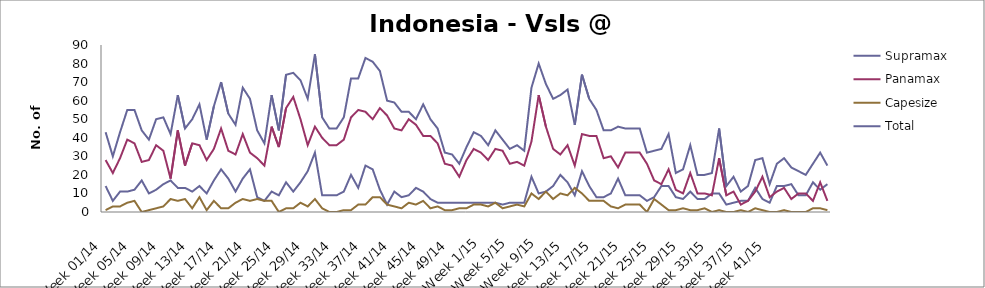
| Category | Supramax | Panamax | Capesize | Total |
|---|---|---|---|---|
| Week 01/14 | 14 | 28 | 1 | 43 |
| Week 02/14 | 6 | 21 | 3 | 30 |
| Week 03/14 | 11 | 29 | 3 | 43 |
| Week 04/14 | 11 | 39 | 5 | 55 |
| Week 05/14 | 12 | 37 | 6 | 55 |
| Week 06/14 | 17 | 27 | 0 | 44 |
| Week 07/14 | 10 | 28 | 1 | 39 |
| Week 08/14 | 12 | 36 | 2 | 50 |
| Week 09/14 | 15 | 33 | 3 | 51 |
| Week 10/14 | 17 | 18 | 7 | 42 |
| Week 11/14 | 13 | 44 | 6 | 63 |
| Week 12/14 | 13 | 25 | 7 | 45 |
| Week 13/14 | 11 | 37 | 2 | 50 |
| Week 14/14 | 14 | 36 | 8 | 58 |
| Week 15/14 | 10 | 28 | 1 | 39 |
| Week 16/14 | 17 | 34 | 6 | 57 |
| Week 17/14 | 23 | 45 | 2 | 70 |
| Week 18/14 | 18 | 33 | 2 | 53 |
| Week 19/14 | 11 | 31 | 5 | 47 |
| Week 20/14 | 18 | 42 | 7 | 67 |
| Week 21/14 | 23 | 32 | 6 | 61 |
| Week 22/14 | 8 | 29 | 7 | 44 |
| Week 23/14 | 6 | 25 | 6 | 37 |
| Week 24/14 | 11 | 46 | 6 | 63 |
| Week 25/14 | 9 | 35 | 0 | 44 |
| Week 26/14 | 16 | 56 | 2 | 74 |
| Week 27/14 | 11 | 62 | 2 | 75 |
| Week 28/14 | 16 | 50 | 5 | 71 |
| Week 29/14 | 22 | 36 | 3 | 61 |
| Week 30/14 | 32 | 46 | 7 | 85 |
| Week 31/14 | 9 | 40 | 2 | 51 |
| Week 32/14 | 9 | 36 | 0 | 45 |
| Week 33/14 | 9 | 36 | 0 | 45 |
| Week 34/14 | 11 | 39 | 1 | 51 |
| Week 35/14 | 20 | 51 | 1 | 72 |
| Week 36/14 | 13 | 55 | 4 | 72 |
| Week 37/14 | 25 | 54 | 4 | 83 |
| Week 38/14 | 23 | 50 | 8 | 81 |
| Week 39/14 | 12 | 56 | 8 | 76 |
| Week 40/14 | 4 | 52 | 4 | 60 |
| Week 41/14 | 11 | 45 | 3 | 59 |
| Week 42/14 | 8 | 44 | 2 | 54 |
| Week 43/14 | 9 | 50 | 5 | 54 |
| Week 44/14 | 13 | 47 | 4 | 50 |
| Week 45/14 | 11 | 41 | 6 | 58 |
| Week 46/14 | 7 | 41 | 2 | 50 |
| Week 47/14 | 5 | 37 | 3 | 45 |
| Week 48/14 | 5 | 26 | 1 | 32 |
| Week 49/14 | 5 | 25 | 1 | 31 |
| Week 50/14 | 5 | 19 | 2 | 26 |
| Week 51/14 | 5 | 28 | 2 | 35 |
| Week 52/14 | 5 | 34 | 4 | 43 |
| Week 1/15 | 5 | 32 | 4 | 41 |
| Week 2/15 | 5 | 28 | 3 | 36 |
| Week 3/15 | 5 | 34 | 5 | 44 |
| Week 4/15 | 4 | 33 | 2 | 39 |
| Week 5/15 | 5 | 26 | 3 | 34 |
| Week 6/15 | 5 | 27 | 4 | 36 |
| Week 7/15 | 5 | 25 | 3 | 33 |
| Week 8/15 | 19 | 38 | 10 | 67 |
| Week 9/15 | 10 | 63 | 7 | 80 |
| Week 10/15 | 11 | 46 | 11 | 69 |
| Week 11/15 | 14 | 34 | 7 | 61 |
| Week 12/15 | 20 | 31 | 10 | 63 |
| Week 13/15 | 16 | 36 | 9 | 66 |
| Week 14/15 | 9 | 25 | 13 | 47 |
| Week 15/15 | 22 | 42 | 10 | 74 |
| Week 16/15 | 14 | 41 | 6 | 61 |
| Week 17/15 | 8 | 41 | 6 | 55 |
| Week 18/15 | 8 | 29 | 6 | 44 |
| Week 19/15 | 10 | 30 | 3 | 44 |
| Week 20/15 | 18 | 24 | 2 | 46 |
| Week 21/15 | 9 | 32 | 4 | 45 |
| Week 22/15 | 9 | 32 | 4 | 45 |
| Week 23/15 | 9 | 32 | 4 | 45 |
| Week 24/15 | 6 | 26 | 0 | 32 |
| Week 25/15 | 8 | 17 | 7 | 33 |
| Week 26/15 | 14 | 15 | 4 | 34 |
| Week 27/15 | 14 | 23 | 1 | 42 |
| Week 28/15 | 8 | 12 | 1 | 21 |
| Week 29/15 | 7 | 10 | 2 | 23 |
| Week 30/15 | 11 | 21 | 1 | 36 |
| Week 31/15 | 7 | 10 | 1 | 20 |
| Week 32/15 | 7 | 10 | 2 | 20 |
| Week 33/15 | 10 | 9 | 0 | 21 |
| Week 34/15 | 10 | 29 | 1 | 45 |
| Week 35/15 | 4 | 9 | 0 | 14 |
| Week 36/15 | 5 | 11 | 0 | 19 |
| Week 37/15 | 6 | 4 | 1 | 11 |
| Week 38/15 | 6 | 6 | 0 | 14 |
| Week 39/15 | 13 | 11 | 2 | 28 |
| Week 40/15 | 7 | 19 | 1 | 29 |
| Week 41/15 | 5 | 8 | 0 | 15 |
| Week 42/15 | 14 | 11 | 0 | 26 |